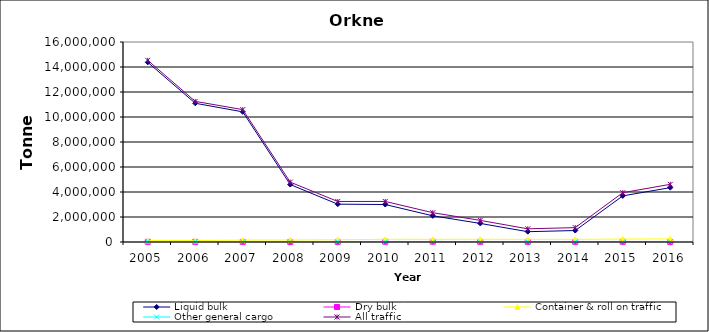
| Category | Liquid bulk | Dry bulk | Container & roll on traffic | Other general cargo | All traffic |
|---|---|---|---|---|---|
| 2005.0 | 14375000 | 15000 | 115000 | 29000 | 14534000 |
| 2006.0 | 11100000 | 12000 | 115000 | 21000 | 11249000 |
| 2007.0 | 10413000 | 10000 | 153000 | 16000 | 10592000 |
| 2008.0 | 4594000 | 6000 | 161000 | 29000 | 4789000 |
| 2009.0 | 3026438 | 12410 | 181740 | 20906 | 3241494 |
| 2010.0 | 2998000 | 20000 | 213000 | 14000 | 3244000 |
| 2011.0 | 2095000 | 25000 | 211000 | 13000 | 2344000 |
| 2012.0 | 1486000 | 15000 | 215000 | 13000 | 1729000 |
| 2013.0 | 824000 | 11000 | 208000 | 11000 | 1054000 |
| 2014.0 | 918000 | 12000 | 209000 | 12000 | 1151000 |
| 2015.0 | 3688000 | 16000 | 234000 | 7000 | 3945000 |
| 2016.0 | 4348000 | 9000 | 243000 | 15000 | 4615000 |